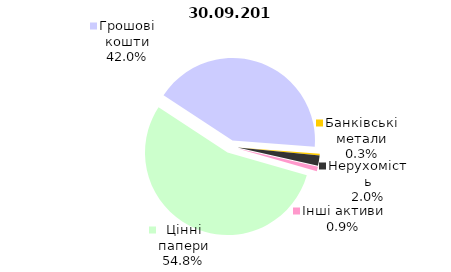
| Category | Всього |
|---|---|
| Цінні папери | 849.749 |
| Грошові кошти | 650.537 |
| Банківські метали | 5.006 |
| Нерухомість | 31.489 |
| Інші активи | 13.492 |